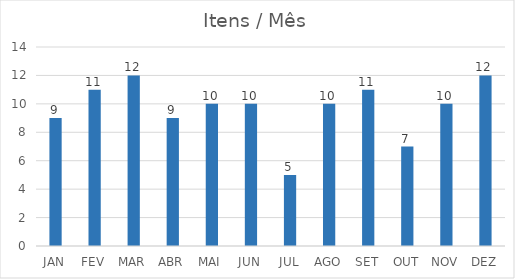
| Category | Series 0 |
|---|---|
| JAN | 9 |
| FEV | 11 |
| MAR | 12 |
| ABR | 9 |
| MAI | 10 |
| JUN | 10 |
| JUL | 5 |
| AGO | 10 |
| SET | 11 |
| OUT | 7 |
| NOV | 10 |
| DEZ | 12 |